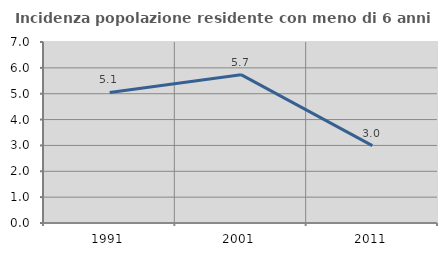
| Category | Incidenza popolazione residente con meno di 6 anni |
|---|---|
| 1991.0 | 5.051 |
| 2001.0 | 5.738 |
| 2011.0 | 2.991 |